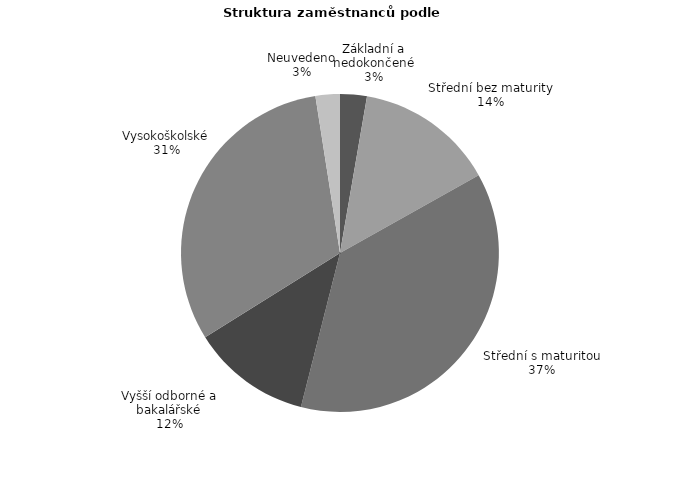
| Category | Series 0 |
|---|---|
| Základní a nedokončené | 18.173 |
| Střední bez maturity | 94.345 |
| Střední s maturitou | 247.61 |
| Vyšší odborné a bakalářské | 81.123 |
| Vysokoškolské | 209.719 |
| Neuvedeno | 16.531 |